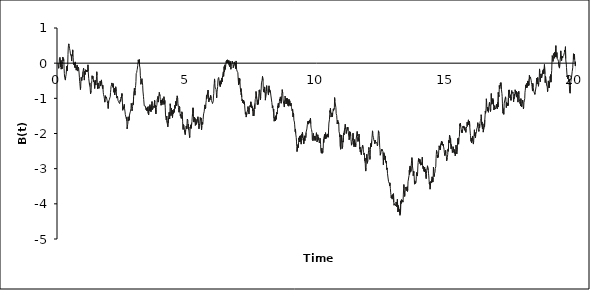
| Category | Series 0 |
|---|---|
| 0.0 | 0 |
| 0.01 | -0.082 |
| 0.02 | -0.145 |
| 0.03 | -0.094 |
| 0.04 | -0.017 |
| 0.05 | 0.13 |
| 0.06 | 0.143 |
| 0.07 | 0.163 |
| 0.08 | 0.085 |
| 0.09 | -0.014 |
| 0.1 | -0.109 |
| 0.11 | 0.081 |
| 0.12 | -0.17 |
| 0.13 | -0.177 |
| 0.14 | -0.107 |
| 0.15 | -0.161 |
| 0.16 | -0.052 |
| 0.17 | 0.055 |
| 0.18 | 0.176 |
| 0.19 | 0.122 |
| 0.2 | 0.074 |
| 0.21 | 0.126 |
| 0.22 | 0.069 |
| 0.23 | -0.16 |
| 0.24 | -0.299 |
| 0.25 | -0.403 |
| 0.26 | -0.421 |
| 0.27 | -0.393 |
| 0.28 | -0.481 |
| 0.29 | -0.394 |
| 0.3 | -0.422 |
| 0.31 | -0.324 |
| 0.32 | -0.346 |
| 0.33 | -0.086 |
| 0.34 | -0.19 |
| 0.35 | -0.224 |
| 0.36 | -0.081 |
| 0.37 | -0.04 |
| 0.38 | 0.252 |
| 0.39 | 0.431 |
| 0.4 | 0.512 |
| 0.41 | 0.549 |
| 0.42 | 0.518 |
| 0.43 | 0.499 |
| 0.44 | 0.422 |
| 0.45 | 0.434 |
| 0.46 | 0.35 |
| 0.47 | 0.286 |
| 0.48 | 0.305 |
| 0.49 | 0.214 |
| 0.5 | 0.199 |
| 0.51 | 0.183 |
| 0.52 | 0.061 |
| 0.53 | 0.24 |
| 0.54 | 0.218 |
| 0.55 | 0.21 |
| 0.56 | 0.378 |
| 0.57 | 0.309 |
| 0.58 | 0.155 |
| 0.59 | -0.017 |
| 0.6 | -0.046 |
| 0.61 | -0.032 |
| 0.62 | -0.006 |
| 0.63 | -0.026 |
| 0.64 | -0.121 |
| 0.65 | 0.006 |
| 0.66 | 0.036 |
| 0.67 | -0.06 |
| 0.68 | -0.133 |
| 0.69 | -0.102 |
| 0.7 | -0.198 |
| 0.71 | -0.143 |
| 0.72 | -0.109 |
| 0.73 | -0.051 |
| 0.74 | -0.057 |
| 0.75 | -0.118 |
| 0.76 | -0.225 |
| 0.77 | -0.112 |
| 0.78 | -0.116 |
| 0.79 | -0.144 |
| 0.8 | -0.207 |
| 0.81 | -0.228 |
| 0.82 | -0.4 |
| 0.83 | -0.525 |
| 0.84 | -0.586 |
| 0.85 | -0.582 |
| 0.86 | -0.751 |
| 0.87 | -0.669 |
| 0.88 | -0.486 |
| 0.89 | -0.403 |
| 0.9 | -0.422 |
| 0.91 | -0.493 |
| 0.92 | -0.459 |
| 0.93 | -0.428 |
| 0.94 | -0.35 |
| 0.95 | -0.387 |
| 0.96 | -0.241 |
| 0.97 | -0.231 |
| 0.98 | -0.143 |
| 0.99 | -0.192 |
| 1.0 | -0.271 |
| 1.01 | -0.482 |
| 1.02 | -0.236 |
| 1.03 | -0.237 |
| 1.04 | -0.324 |
| 1.05 | -0.268 |
| 1.06 | -0.186 |
| 1.07 | -0.18 |
| 1.08 | -0.23 |
| 1.09 | -0.201 |
| 1.1 | -0.245 |
| 1.11 | -0.195 |
| 1.12 | -0.244 |
| 1.13 | -0.268 |
| 1.14 | -0.19 |
| 1.15 | -0.047 |
| 1.16 | -0.231 |
| 1.17 | -0.236 |
| 1.18 | -0.438 |
| 1.19 | -0.446 |
| 1.2 | -0.428 |
| 1.21 | -0.619 |
| 1.22 | -0.562 |
| 1.23 | -0.669 |
| 1.24 | -0.68 |
| 1.25 | -0.872 |
| 1.26 | -0.9 |
| 1.27 | -0.792 |
| 1.28 | -0.617 |
| 1.29 | -0.574 |
| 1.3 | -0.496 |
| 1.31 | -0.357 |
| 1.32 | -0.436 |
| 1.33 | -0.405 |
| 1.34 | -0.37 |
| 1.35 | -0.414 |
| 1.36 | -0.416 |
| 1.37 | -0.531 |
| 1.38 | -0.492 |
| 1.39 | -0.53 |
| 1.4 | -0.649 |
| 1.41 | -0.72 |
| 1.42 | -0.538 |
| 1.43 | -0.58 |
| 1.44 | -0.494 |
| 1.45 | -0.622 |
| 1.46 | -0.583 |
| 1.47 | -0.542 |
| 1.48 | -0.387 |
| 1.49 | -0.244 |
| 1.5 | -0.342 |
| 1.51 | -0.543 |
| 1.52 | -0.726 |
| 1.53 | -0.67 |
| 1.54 | -0.56 |
| 1.55 | -0.668 |
| 1.56 | -0.644 |
| 1.57 | -0.723 |
| 1.58 | -0.701 |
| 1.59 | -0.726 |
| 1.6 | -0.675 |
| 1.61 | -0.677 |
| 1.62 | -0.507 |
| 1.63 | -0.613 |
| 1.64 | -0.649 |
| 1.65 | -0.582 |
| 1.66 | -0.573 |
| 1.67 | -0.476 |
| 1.68 | -0.584 |
| 1.69 | -0.558 |
| 1.7 | -0.649 |
| 1.71 | -0.717 |
| 1.72 | -0.627 |
| 1.73 | -0.731 |
| 1.74 | -0.828 |
| 1.75 | -0.892 |
| 1.76 | -0.909 |
| 1.77 | -0.948 |
| 1.78 | -0.995 |
| 1.79 | -0.972 |
| 1.8 | -1.108 |
| 1.81 | -1.03 |
| 1.82 | -0.924 |
| 1.83 | -0.997 |
| 1.84 | -1.01 |
| 1.85 | -1.004 |
| 1.86 | -0.958 |
| 1.87 | -0.968 |
| 1.88 | -0.938 |
| 1.89 | -1.068 |
| 1.9 | -1.071 |
| 1.91 | -1.143 |
| 1.92 | -1.144 |
| 1.93 | -1.29 |
| 1.94 | -1.28 |
| 1.95 | -1.078 |
| 1.96 | -1.062 |
| 1.97 | -1.098 |
| 1.98 | -1.027 |
| 1.99 | -0.989 |
| 2.0 | -0.98 |
| 2.01 | -0.956 |
| 2.02 | -0.834 |
| 2.03 | -0.755 |
| 2.04 | -0.663 |
| 2.05 | -0.665 |
| 2.06 | -0.616 |
| 2.07 | -0.562 |
| 2.08 | -0.607 |
| 2.09 | -0.583 |
| 2.1 | -0.656 |
| 2.11 | -0.686 |
| 2.12 | -0.581 |
| 2.13 | -0.621 |
| 2.14 | -0.729 |
| 2.15 | -0.829 |
| 2.16 | -0.744 |
| 2.17 | -0.706 |
| 2.18 | -0.904 |
| 2.19 | -0.862 |
| 2.2 | -0.847 |
| 2.21 | -0.827 |
| 2.22 | -0.67 |
| 2.23 | -0.677 |
| 2.24 | -0.791 |
| 2.25 | -0.905 |
| 2.26 | -0.993 |
| 2.27 | -0.988 |
| 2.28 | -0.981 |
| 2.29 | -0.942 |
| 2.3 | -0.955 |
| 2.31 | -1.064 |
| 2.32 | -1.045 |
| 2.33 | -1.096 |
| 2.34 | -1.124 |
| 2.35 | -1.096 |
| 2.36 | -1.068 |
| 2.37 | -1.149 |
| 2.38 | -1.145 |
| 2.39 | -1.052 |
| 2.4 | -1.053 |
| 2.41 | -1.087 |
| 2.42 | -1.005 |
| 2.43 | -0.964 |
| 2.44 | -0.994 |
| 2.45 | -0.972 |
| 2.46 | -0.864 |
| 2.47 | -0.939 |
| 2.48 | -1.132 |
| 2.49 | -1.339 |
| 2.5 | -1.313 |
| 2.51 | -1.241 |
| 2.52 | -1.294 |
| 2.53 | -1.255 |
| 2.54 | -1.241 |
| 2.55 | -1.172 |
| 2.56 | -1.285 |
| 2.57 | -1.287 |
| 2.58 | -1.386 |
| 2.59 | -1.458 |
| 2.6 | -1.484 |
| 2.61 | -1.467 |
| 2.62 | -1.439 |
| 2.63 | -1.581 |
| 2.64 | -1.546 |
| 2.65 | -1.643 |
| 2.66 | -1.868 |
| 2.67 | -1.811 |
| 2.68 | -1.747 |
| 2.69 | -1.707 |
| 2.7 | -1.525 |
| 2.71 | -1.645 |
| 2.72 | -1.586 |
| 2.73 | -1.606 |
| 2.74 | -1.623 |
| 2.75 | -1.481 |
| 2.76 | -1.458 |
| 2.77 | -1.415 |
| 2.78 | -1.423 |
| 2.79 | -1.366 |
| 2.8 | -1.358 |
| 2.81 | -1.286 |
| 2.82 | -1.144 |
| 2.83 | -1.201 |
| 2.84 | -1.274 |
| 2.85 | -1.356 |
| 2.86 | -1.3 |
| 2.87 | -1.23 |
| 2.88 | -1.159 |
| 2.89 | -1.129 |
| 2.9 | -1.178 |
| 2.91 | -0.948 |
| 2.92 | -0.818 |
| 2.93 | -0.779 |
| 2.94 | -0.713 |
| 2.95 | -0.827 |
| 2.96 | -0.911 |
| 2.97 | -0.786 |
| 2.98 | -0.696 |
| 2.99 | -0.628 |
| 3.0 | -0.522 |
| 3.01 | -0.299 |
| 3.02 | -0.312 |
| 3.03 | -0.261 |
| 3.04 | -0.209 |
| 3.05 | -0.178 |
| 3.06 | -0.15 |
| 3.07 | -0.066 |
| 3.08 | 0.01 |
| 3.09 | 0.093 |
| 3.1 | 0.045 |
| 3.11 | 0.007 |
| 3.12 | 0.032 |
| 3.13 | 0.102 |
| 3.14 | -0.078 |
| 3.15 | -0.112 |
| 3.16 | -0.164 |
| 3.17 | -0.36 |
| 3.18 | -0.441 |
| 3.19 | -0.601 |
| 3.2 | -0.608 |
| 3.21 | -0.59 |
| 3.22 | -0.477 |
| 3.23 | -0.441 |
| 3.24 | -0.47 |
| 3.25 | -0.563 |
| 3.26 | -0.633 |
| 3.27 | -0.792 |
| 3.28 | -0.796 |
| 3.29 | -0.942 |
| 3.3 | -1.034 |
| 3.31 | -1.062 |
| 3.32 | -1.213 |
| 3.33 | -1.227 |
| 3.34 | -1.198 |
| 3.35 | -1.236 |
| 3.36 | -1.219 |
| 3.37 | -1.22 |
| 3.38 | -1.204 |
| 3.39 | -1.325 |
| 3.4 | -1.313 |
| 3.41 | -1.272 |
| 3.42 | -1.251 |
| 3.43 | -1.359 |
| 3.44 | -1.277 |
| 3.45 | -1.281 |
| 3.46 | -1.241 |
| 3.47 | -1.424 |
| 3.48 | -1.449 |
| 3.49 | -1.474 |
| 3.5 | -1.316 |
| 3.51 | -1.227 |
| 3.52 | -1.348 |
| 3.53 | -1.253 |
| 3.54 | -1.18 |
| 3.55 | -1.257 |
| 3.56 | -1.357 |
| 3.57 | -1.248 |
| 3.58 | -1.38 |
| 3.59 | -1.368 |
| 3.6 | -1.2 |
| 3.61 | -1.149 |
| 3.62 | -1.091 |
| 3.63 | -1.268 |
| 3.64 | -1.321 |
| 3.65 | -1.347 |
| 3.66 | -1.262 |
| 3.67 | -1.291 |
| 3.68 | -1.226 |
| 3.69 | -1.218 |
| 3.7 | -1.265 |
| 3.71 | -1.25 |
| 3.72 | -1.06 |
| 3.73 | -1.096 |
| 3.74 | -1.254 |
| 3.75 | -1.203 |
| 3.76 | -1.383 |
| 3.77 | -1.445 |
| 3.78 | -1.335 |
| 3.79 | -1.257 |
| 3.8 | -1.213 |
| 3.81 | -1.177 |
| 3.82 | -1.024 |
| 3.83 | -1.039 |
| 3.84 | -0.989 |
| 3.85 | -0.944 |
| 3.86 | -1.107 |
| 3.87 | -1.043 |
| 3.88 | -0.952 |
| 3.89 | -0.952 |
| 3.9 | -0.83 |
| 3.91 | -0.857 |
| 3.92 | -0.847 |
| 3.93 | -0.94 |
| 3.94 | -1.038 |
| 3.95 | -1.128 |
| 3.96 | -1.062 |
| 3.97 | -1.195 |
| 3.98 | -1.165 |
| 3.99 | -1.05 |
| 4.0 | -1.137 |
| 4.01 | -1.105 |
| 4.02 | -1.011 |
| 4.03 | -1.105 |
| 4.04 | -1.18 |
| 4.05 | -1.18 |
| 4.06 | -1.169 |
| 4.07 | -1.071 |
| 4.08 | -0.953 |
| 4.09 | -1.049 |
| 4.1 | -1.168 |
| 4.11 | -1.058 |
| 4.12 | -1.153 |
| 4.13 | -1.252 |
| 4.14 | -1.473 |
| 4.15 | -1.487 |
| 4.16 | -1.575 |
| 4.17 | -1.615 |
| 4.18 | -1.539 |
| 4.19 | -1.505 |
| 4.2 | -1.686 |
| 4.21 | -1.693 |
| 4.22 | -1.764 |
| 4.23 | -1.81 |
| 4.24 | -1.66 |
| 4.25 | -1.69 |
| 4.26 | -1.556 |
| 4.27 | -1.461 |
| 4.28 | -1.397 |
| 4.29 | -1.52 |
| 4.3 | -1.584 |
| 4.31 | -1.381 |
| 4.32 | -1.154 |
| 4.33 | -1.221 |
| 4.34 | -1.299 |
| 4.35 | -1.495 |
| 4.36 | -1.382 |
| 4.37 | -1.281 |
| 4.38 | -1.45 |
| 4.39 | -1.414 |
| 4.4 | -1.333 |
| 4.41 | -1.545 |
| 4.42 | -1.409 |
| 4.43 | -1.44 |
| 4.44 | -1.447 |
| 4.45 | -1.366 |
| 4.46 | -1.412 |
| 4.47 | -1.311 |
| 4.48 | -1.381 |
| 4.49 | -1.29 |
| 4.5 | -1.197 |
| 4.51 | -1.285 |
| 4.52 | -1.239 |
| 4.53 | -1.088 |
| 4.54 | -1.147 |
| 4.55 | -1.143 |
| 4.56 | -1.171 |
| 4.57 | -1.208 |
| 4.58 | -0.987 |
| 4.59 | -0.929 |
| 4.6 | -0.945 |
| 4.61 | -1.001 |
| 4.62 | -1.14 |
| 4.63 | -1.123 |
| 4.64 | -1.263 |
| 4.65 | -1.33 |
| 4.66 | -1.395 |
| 4.67 | -1.31 |
| 4.68 | -1.23 |
| 4.69 | -1.264 |
| 4.7 | -1.424 |
| 4.71 | -1.493 |
| 4.72 | -1.456 |
| 4.73 | -1.471 |
| 4.74 | -1.458 |
| 4.75 | -1.569 |
| 4.76 | -1.515 |
| 4.769999999999999 | -1.382 |
| 4.78 | -1.409 |
| 4.79 | -1.45 |
| 4.8 | -1.649 |
| 4.81 | -1.843 |
| 4.82 | -1.887 |
| 4.83 | -1.746 |
| 4.84 | -1.719 |
| 4.85 | -1.782 |
| 4.86 | -1.778 |
| 4.87 | -1.877 |
| 4.88 | -1.966 |
| 4.89 | -1.906 |
| 4.9 | -2.028 |
| 4.91 | -1.964 |
| 4.92 | -1.949 |
| 4.93 | -1.941 |
| 4.94 | -1.789 |
| 4.95 | -1.868 |
| 4.96 | -1.783 |
| 4.97 | -1.712 |
| 4.98 | -1.588 |
| 4.99 | -1.584 |
| 5.0 | -1.617 |
| 5.01 | -1.865 |
| 5.02 | -1.732 |
| 5.03 | -1.74 |
| 5.04 | -1.911 |
| 5.05 | -1.9 |
| 5.06 | -1.918 |
| 5.07 | -2.117 |
| 5.08 | -2.081 |
| 5.09 | -1.816 |
| 5.1 | -1.847 |
| 5.11 | -1.755 |
| 5.12 | -1.794 |
| 5.13 | -1.857 |
| 5.14 | -1.851 |
| 5.15 | -1.708 |
| 5.16 | -1.655 |
| 5.17 | -1.535 |
| 5.18 | -1.446 |
| 5.19 | -1.5 |
| 5.2 | -1.27 |
| 5.21 | -1.416 |
| 5.22 | -1.566 |
| 5.23 | -1.676 |
| 5.24 | -1.614 |
| 5.25 | -1.533 |
| 5.26 | -1.613 |
| 5.27 | -1.558 |
| 5.28 | -1.683 |
| 5.29 | -1.771 |
| 5.3 | -1.733 |
| 5.31 | -1.596 |
| 5.32 | -1.634 |
| 5.33 | -1.742 |
| 5.34 | -1.768 |
| 5.35 | -1.74 |
| 5.36 | -1.734 |
| 5.37 | -1.586 |
| 5.38 | -1.57 |
| 5.39 | -1.524 |
| 5.4 | -1.508 |
| 5.41 | -1.719 |
| 5.42 | -1.777 |
| 5.43 | -1.868 |
| 5.44 | -1.761 |
| 5.45 | -1.761 |
| 5.46 | -1.73 |
| 5.47 | -1.611 |
| 5.48 | -1.546 |
| 5.49 | -1.547 |
| 5.5 | -1.62 |
| 5.51 | -1.558 |
| 5.52 | -1.773 |
| 5.53 | -1.896 |
| 5.54 | -1.78 |
| 5.55 | -1.675 |
| 5.56 | -1.683 |
| 5.57 | -1.739 |
| 5.58 | -1.69 |
| 5.59 | -1.606 |
| 5.6 | -1.502 |
| 5.61 | -1.441 |
| 5.62 | -1.447 |
| 5.63 | -1.382 |
| 5.64 | -1.368 |
| 5.65 | -1.226 |
| 5.66 | -1.187 |
| 5.67 | -1.194 |
| 5.68 | -1.292 |
| 5.69 | -1.259 |
| 5.7 | -1.113 |
| 5.71 | -1.07 |
| 5.72 | -0.917 |
| 5.73 | -1.01 |
| 5.74 | -1.025 |
| 5.75 | -1.028 |
| 5.76 | -0.85 |
| 5.769999999999999 | -0.845 |
| 5.78 | -0.763 |
| 5.79 | -0.869 |
| 5.8 | -0.963 |
| 5.81 | -1.103 |
| 5.82 | -1.111 |
| 5.83 | -0.999 |
| 5.84 | -1.004 |
| 5.85 | -1.045 |
| 5.86 | -1.07 |
| 5.87 | -1.061 |
| 5.88 | -0.915 |
| 5.89 | -0.912 |
| 5.9 | -0.99 |
| 5.91 | -1.06 |
| 5.92 | -1.037 |
| 5.93 | -1.087 |
| 5.94 | -1.115 |
| 5.95 | -1.149 |
| 5.96 | -1.158 |
| 5.97 | -1.122 |
| 5.98 | -1.088 |
| 5.99 | -0.931 |
| 6.0 | -0.867 |
| 6.01 | -0.652 |
| 6.02 | -0.575 |
| 6.03 | -0.448 |
| 6.04 | -0.541 |
| 6.05 | -0.679 |
| 6.06 | -0.696 |
| 6.07 | -0.651 |
| 6.08 | -0.68 |
| 6.09 | -0.749 |
| 6.1 | -0.838 |
| 6.11 | -0.991 |
| 6.12 | -0.916 |
| 6.13 | -0.793 |
| 6.14 | -0.753 |
| 6.15 | -0.665 |
| 6.16 | -0.508 |
| 6.17 | -0.441 |
| 6.18 | -0.431 |
| 6.19 | -0.407 |
| 6.2 | -0.406 |
| 6.21 | -0.504 |
| 6.22 | -0.626 |
| 6.23 | -0.555 |
| 6.24 | -0.523 |
| 6.25 | -0.665 |
| 6.26 | -0.61 |
| 6.27 | -0.499 |
| 6.28 | -0.598 |
| 6.29 | -0.618 |
| 6.3 | -0.521 |
| 6.31 | -0.42 |
| 6.32 | -0.532 |
| 6.33 | -0.457 |
| 6.34 | -0.358 |
| 6.35 | -0.38 |
| 6.36 | -0.358 |
| 6.37 | -0.246 |
| 6.38 | -0.375 |
| 6.39 | -0.253 |
| 6.4 | -0.098 |
| 6.41 | -0.244 |
| 6.42 | -0.193 |
| 6.43 | -0.046 |
| 6.44 | -0.177 |
| 6.45 | -0.186 |
| 6.46 | -0.078 |
| 6.47 | -0.092 |
| 6.48 | 0.051 |
| 6.49 | 0.016 |
| 6.5 | -0.008 |
| 6.51 | 0.089 |
| 6.52 | 0.006 |
| 6.53 | 0.095 |
| 6.54 | 0.052 |
| 6.55 | 0.01 |
| 6.56 | 0.012 |
| 6.57 | 0.033 |
| 6.58 | 0.075 |
| 6.59 | -0.053 |
| 6.6 | -0.026 |
| 6.61 | -0.036 |
| 6.62 | -0.102 |
| 6.63 | 0.052 |
| 6.64 | 0.054 |
| 6.65 | -0.05 |
| 6.66 | -0.173 |
| 6.67 | -0.104 |
| 6.68 | -0.047 |
| 6.69 | -0.063 |
| 6.7 | -0.002 |
| 6.71 | 0.06 |
| 6.72 | 0.062 |
| 6.73 | 0.036 |
| 6.74 | 0.007 |
| 6.75 | -0.13 |
| 6.76 | -0.104 |
| 6.769999999999999 | -0.122 |
| 6.78 | -0.052 |
| 6.79 | -0.042 |
| 6.8 | 0.036 |
| 6.81 | 0.004 |
| 6.82 | -0.041 |
| 6.83 | -0.01 |
| 6.84 | -0.152 |
| 6.85 | -0.118 |
| 6.86 | 0.063 |
| 6.87 | 0.027 |
| 6.88 | -0.172 |
| 6.89 | -0.2 |
| 6.9 | -0.228 |
| 6.91 | -0.233 |
| 6.92 | -0.236 |
| 6.93 | -0.272 |
| 6.94 | -0.422 |
| 6.95 | -0.404 |
| 6.96 | -0.622 |
| 6.97 | -0.421 |
| 6.98 | -0.456 |
| 6.99 | -0.577 |
| 7.0 | -0.44 |
| 7.01 | -0.497 |
| 7.02 | -0.678 |
| 7.03 | -0.687 |
| 7.04 | -0.806 |
| 7.05 | -0.723 |
| 7.06 | -0.898 |
| 7.07 | -0.844 |
| 7.08 | -0.967 |
| 7.09 | -1.071 |
| 7.1 | -1.035 |
| 7.11 | -1.036 |
| 7.12 | -1.043 |
| 7.13 | -1.133 |
| 7.14 | -1.113 |
| 7.15 | -1.049 |
| 7.16 | -1.042 |
| 7.17 | -1.155 |
| 7.18 | -1.1 |
| 7.19 | -1.197 |
| 7.2 | -1.192 |
| 7.21 | -1.374 |
| 7.22 | -1.45 |
| 7.23 | -1.386 |
| 7.24 | -1.463 |
| 7.25 | -1.533 |
| 7.26 | -1.56 |
| 7.27 | -1.511 |
| 7.28 | -1.414 |
| 7.29 | -1.406 |
| 7.3 | -1.42 |
| 7.31 | -1.314 |
| 7.32 | -1.233 |
| 7.33 | -1.327 |
| 7.34 | -1.394 |
| 7.35 | -1.412 |
| 7.36 | -1.446 |
| 7.37 | -1.261 |
| 7.38 | -1.222 |
| 7.39 | -1.2 |
| 7.4 | -1.24 |
| 7.41 | -1.191 |
| 7.42 | -1.249 |
| 7.43 | -1.099 |
| 7.44 | -1.184 |
| 7.45 | -1.213 |
| 7.46 | -1.184 |
| 7.47 | -1.271 |
| 7.48 | -1.235 |
| 7.49 | -1.275 |
| 7.5 | -1.36 |
| 7.51 | -1.291 |
| 7.52 | -1.495 |
| 7.53 | -1.458 |
| 7.54 | -1.455 |
| 7.55 | -1.496 |
| 7.56 | -1.319 |
| 7.57 | -1.205 |
| 7.58 | -1.299 |
| 7.59 | -1.141 |
| 7.6 | -1.029 |
| 7.61 | -0.998 |
| 7.62 | -0.933 |
| 7.63 | -0.805 |
| 7.64 | -0.827 |
| 7.65 | -0.823 |
| 7.66 | -1.012 |
| 7.67 | -1.125 |
| 7.68 | -1.173 |
| 7.69 | -1.094 |
| 7.7 | -1.178 |
| 7.71 | -1.039 |
| 7.72 | -1.148 |
| 7.73 | -1.047 |
| 7.74 | -0.868 |
| 7.75 | -0.77 |
| 7.76 | -0.806 |
| 7.769999999999999 | -0.759 |
| 7.78 | -0.768 |
| 7.79 | -0.786 |
| 7.8 | -1.041 |
| 7.81 | -0.962 |
| 7.82 | -0.832 |
| 7.83 | -0.707 |
| 7.84 | -0.56 |
| 7.85 | -0.563 |
| 7.86 | -0.501 |
| 7.87 | -0.442 |
| 7.88 | -0.376 |
| 7.89 | -0.375 |
| 7.9 | -0.494 |
| 7.91 | -0.716 |
| 7.92 | -0.816 |
| 7.93 | -0.782 |
| 7.94 | -0.729 |
| 7.95 | -0.828 |
| 7.96 | -0.676 |
| 7.97 | -0.73 |
| 7.98 | -0.797 |
| 7.99 | -1.052 |
| 8.0 | -1.038 |
| 8.01 | -1.029 |
| 8.02 | -0.814 |
| 8.03 | -0.733 |
| 8.04 | -0.639 |
| 8.05 | -0.795 |
| 8.06 | -0.792 |
| 8.07 | -0.78 |
| 8.08 | -0.784 |
| 8.09 | -0.838 |
| 8.1 | -0.834 |
| 8.11 | -0.906 |
| 8.12 | -0.734 |
| 8.13 | -0.644 |
| 8.14 | -0.825 |
| 8.15 | -0.736 |
| 8.16 | -0.809 |
| 8.17 | -0.788 |
| 8.18 | -0.778 |
| 8.19 | -0.759 |
| 8.2 | -0.906 |
| 8.21 | -0.882 |
| 8.22 | -0.926 |
| 8.23 | -0.891 |
| 8.24 | -1.12 |
| 8.25 | -1.194 |
| 8.26 | -1.273 |
| 8.27 | -1.209 |
| 8.28 | -1.242 |
| 8.29 | -1.259 |
| 8.3 | -1.371 |
| 8.31 | -1.308 |
| 8.32 | -1.569 |
| 8.33 | -1.651 |
| 8.34 | -1.637 |
| 8.35 | -1.547 |
| 8.36 | -1.562 |
| 8.37 | -1.575 |
| 8.38 | -1.643 |
| 8.39 | -1.496 |
| 8.4 | -1.543 |
| 8.41 | -1.598 |
| 8.42 | -1.572 |
| 8.43 | -1.401 |
| 8.44 | -1.443 |
| 8.45 | -1.41 |
| 8.46 | -1.312 |
| 8.47 | -1.214 |
| 8.48 | -1.26 |
| 8.49 | -1.143 |
| 8.5 | -1.263 |
| 8.51 | -1.241 |
| 8.52 | -1.209 |
| 8.53 | -1.096 |
| 8.54 | -1.027 |
| 8.55 | -1.067 |
| 8.56 | -1.091 |
| 8.57 | -0.959 |
| 8.58 | -1.067 |
| 8.59 | -0.998 |
| 8.6 | -1.139 |
| 8.61 | -1.027 |
| 8.62 | -0.926 |
| 8.63 | -0.835 |
| 8.64 | -0.753 |
| 8.65 | -0.729 |
| 8.66 | -0.857 |
| 8.67 | -1.017 |
| 8.68 | -1.076 |
| 8.69 | -1.07 |
| 8.7 | -1.072 |
| 8.71 | -1.072 |
| 8.72 | -1.248 |
| 8.73 | -1.243 |
| 8.74 | -1.053 |
| 8.75 | -0.939 |
| 8.76 | -0.981 |
| 8.77 | -0.977 |
| 8.78 | -1.156 |
| 8.79 | -1.165 |
| 8.8 | -1.121 |
| 8.81 | -0.997 |
| 8.82 | -1.15 |
| 8.83 | -1.155 |
| 8.84 | -1.005 |
| 8.85 | -1.098 |
| 8.86 | -1.206 |
| 8.87 | -1.074 |
| 8.88 | -1.143 |
| 8.89 | -1.224 |
| 8.9 | -1.029 |
| 8.91 | -1.185 |
| 8.92 | -1.212 |
| 8.93 | -1.07 |
| 8.94 | -1.075 |
| 8.95 | -1.209 |
| 8.96 | -1.196 |
| 8.97 | -1.208 |
| 8.98 | -1.14 |
| 8.99 | -1.223 |
| 9.0 | -1.268 |
| 9.01 | -1.256 |
| 9.02 | -1.349 |
| 9.03 | -1.367 |
| 9.04 | -1.305 |
| 9.05 | -1.31 |
| 9.06 | -1.53 |
| 9.07 | -1.421 |
| 9.08 | -1.452 |
| 9.09 | -1.622 |
| 9.1 | -1.623 |
| 9.11 | -1.674 |
| 9.12 | -1.755 |
| 9.13 | -1.737 |
| 9.14 | -1.949 |
| 9.15 | -1.871 |
| 9.16 | -2.003 |
| 9.17 | -2.011 |
| 9.18 | -2.114 |
| 9.19 | -2.217 |
| 9.2 | -2.372 |
| 9.21 | -2.514 |
| 9.22 | -2.512 |
| 9.23 | -2.492 |
| 9.24 | -2.346 |
| 9.25 | -2.311 |
| 9.26 | -2.401 |
| 9.27 | -2.26 |
| 9.28 | -2.126 |
| 9.29 | -2.18 |
| 9.3 | -2.158 |
| 9.31 | -2.073 |
| 9.32 | -2.238 |
| 9.33 | -2.238 |
| 9.34 | -2.062 |
| 9.35 | -2.206 |
| 9.36 | -2.221 |
| 9.37 | -2.303 |
| 9.38 | -2.243 |
| 9.39 | -2.057 |
| 9.4 | -2.012 |
| 9.41 | -2.107 |
| 9.42 | -1.967 |
| 9.43 | -1.982 |
| 9.44 | -2.132 |
| 9.45 | -2.19 |
| 9.46 | -2.141 |
| 9.47 | -2.291 |
| 9.48 | -2.219 |
| 9.49 | -2.118 |
| 9.5 | -2.066 |
| 9.51 | -2.206 |
| 9.52 | -2.135 |
| 9.53 | -2.075 |
| 9.54 | -2.1 |
| 9.55 | -2.111 |
| 9.56 | -1.972 |
| 9.57 | -1.93 |
| 9.58 | -1.904 |
| 9.59 | -1.87 |
| 9.6 | -1.854 |
| 9.61 | -1.741 |
| 9.62 | -1.749 |
| 9.63 | -1.653 |
| 9.64 | -1.735 |
| 9.65 | -1.65 |
| 9.66 | -1.622 |
| 9.67 | -1.707 |
| 9.68 | -1.696 |
| 9.69 | -1.63 |
| 9.7 | -1.603 |
| 9.71 | -1.681 |
| 9.72 | -1.671 |
| 9.73 | -1.561 |
| 9.74 | -1.723 |
| 9.75 | -1.823 |
| 9.76 | -1.861 |
| 9.77 | -1.889 |
| 9.78 | -1.882 |
| 9.79 | -1.976 |
| 9.8 | -2.175 |
| 9.81 | -2.197 |
| 9.82 | -2.204 |
| 9.83 | -2.05 |
| 9.84 | -1.996 |
| 9.85 | -2.054 |
| 9.86 | -2.062 |
| 9.87 | -2.198 |
| 9.88 | -2.071 |
| 9.89 | -2.111 |
| 9.9 | -2.073 |
| 9.91 | -2.053 |
| 9.92 | -2.054 |
| 9.93 | -2.195 |
| 9.94 | -2.128 |
| 9.95 | -2.02 |
| 9.96 | -1.978 |
| 9.97 | -2.08 |
| 9.98 | -2.239 |
| 9.99 | -2.243 |
| 10.0 | -2.191 |
| 10.01 | -2.035 |
| 10.02 | -2.088 |
| 10.03 | -2.141 |
| 10.04 | -2.101 |
| 10.05 | -2.186 |
| 10.06 | -2.215 |
| 10.07 | -2.264 |
| 10.08 | -2.231 |
| 10.09 | -2.169 |
| 10.1 | -2.136 |
| 10.11 | -2.178 |
| 10.12 | -2.306 |
| 10.13 | -2.504 |
| 10.14 | -2.489 |
| 10.15 | -2.557 |
| 10.16 | -2.475 |
| 10.17 | -2.415 |
| 10.18 | -2.563 |
| 10.19 | -2.505 |
| 10.2 | -2.545 |
| 10.21 | -2.506 |
| 10.22 | -2.418 |
| 10.23 | -2.172 |
| 10.24 | -2.257 |
| 10.25 | -2.238 |
| 10.26 | -2.085 |
| 10.27 | -2.025 |
| 10.28 | -2.146 |
| 10.29 | -2.11 |
| 10.3 | -2.152 |
| 10.31 | -1.978 |
| 10.32 | -2.08 |
| 10.33 | -2.144 |
| 10.34 | -2.091 |
| 10.35 | -2.037 |
| 10.36 | -2.094 |
| 10.37 | -2.08 |
| 10.38 | -2.11 |
| 10.39 | -2.072 |
| 10.4 | -2.012 |
| 10.41 | -2.106 |
| 10.42 | -2.05 |
| 10.43 | -1.843 |
| 10.44 | -1.703 |
| 10.45 | -1.687 |
| 10.46 | -1.611 |
| 10.47 | -1.471 |
| 10.48 | -1.349 |
| 10.49 | -1.401 |
| 10.5 | -1.277 |
| 10.51 | -1.432 |
| 10.52 | -1.532 |
| 10.53 | -1.503 |
| 10.54 | -1.462 |
| 10.55 | -1.457 |
| 10.56 | -1.412 |
| 10.57 | -1.522 |
| 10.58 | -1.49 |
| 10.59 | -1.402 |
| 10.6 | -1.363 |
| 10.61 | -1.302 |
| 10.62 | -1.344 |
| 10.63 | -1.351 |
| 10.64 | -1.32 |
| 10.65 | -1.269 |
| 10.66 | -0.979 |
| 10.67 | -1.075 |
| 10.68 | -1.06 |
| 10.69 | -1.083 |
| 10.7 | -1.103 |
| 10.71 | -1.268 |
| 10.72 | -1.432 |
| 10.73 | -1.459 |
| 10.74 | -1.488 |
| 10.75 | -1.596 |
| 10.76 | -1.726 |
| 10.77 | -1.721 |
| 10.78 | -1.625 |
| 10.79 | -1.632 |
| 10.8 | -1.727 |
| 10.81 | -1.682 |
| 10.82 | -1.712 |
| 10.83 | -1.94 |
| 10.84 | -1.934 |
| 10.85 | -2.011 |
| 10.86 | -2.095 |
| 10.87 | -2.037 |
| 10.88 | -2.369 |
| 10.89 | -2.449 |
| 10.9 | -2.336 |
| 10.91 | -2.276 |
| 10.92 | -2.183 |
| 10.93 | -2.045 |
| 10.94 | -2.234 |
| 10.95 | -2.43 |
| 10.96 | -2.401 |
| 10.97 | -2.365 |
| 10.98 | -2.216 |
| 10.99 | -2.245 |
| 11.0 | -2.108 |
| 11.01 | -1.994 |
| 11.02 | -2.039 |
| 11.03 | -2.039 |
| 11.04 | -1.904 |
| 11.05 | -1.825 |
| 11.06 | -1.835 |
| 11.07 | -1.736 |
| 11.08 | -1.738 |
| 11.09 | -1.884 |
| 11.1 | -1.961 |
| 11.11 | -2 |
| 11.12 | -1.929 |
| 11.13 | -1.88 |
| 11.14 | -1.867 |
| 11.15 | -1.818 |
| 11.16 | -1.878 |
| 11.17 | -1.824 |
| 11.18 | -1.926 |
| 11.19 | -1.932 |
| 11.2 | -2.043 |
| 11.21 | -2.102 |
| 11.22 | -2.179 |
| 11.23 | -2.13 |
| 11.24 | -1.943 |
| 11.25 | -2.007 |
| 11.26 | -1.981 |
| 11.27 | -1.969 |
| 11.28 | -2.067 |
| 11.29 | -2.177 |
| 11.3 | -2.238 |
| 11.31 | -2.332 |
| 11.32 | -2.325 |
| 11.33 | -2.275 |
| 11.34 | -2.22 |
| 11.35 | -2.2 |
| 11.36 | -2.107 |
| 11.37 | -1.99 |
| 11.38 | -2.203 |
| 11.39 | -2.324 |
| 11.4 | -2.222 |
| 11.41 | -2.376 |
| 11.42 | -2.283 |
| 11.43 | -2.172 |
| 11.44 | -2.323 |
| 11.45 | -2.268 |
| 11.46 | -2.277 |
| 11.47 | -2.384 |
| 11.48 | -2.292 |
| 11.49 | -2.158 |
| 11.5 | -2.138 |
| 11.51 | -2.172 |
| 11.52 | -2.146 |
| 11.53 | -1.943 |
| 11.54 | -2.042 |
| 11.55 | -2.089 |
| 11.56 | -2.228 |
| 11.57 | -2.118 |
| 11.58 | -2.194 |
| 11.59 | -2.163 |
| 11.6 | -2.014 |
| 11.61 | -2.116 |
| 11.62 | -2.214 |
| 11.63 | -2.435 |
| 11.64 | -2.387 |
| 11.65 | -2.526 |
| 11.66 | -2.51 |
| 11.67 | -2.48 |
| 11.68 | -2.463 |
| 11.69 | -2.6 |
| 11.7 | -2.558 |
| 11.71 | -2.421 |
| 11.72 | -2.433 |
| 11.73 | -2.428 |
| 11.74 | -2.332 |
| 11.75 | -2.324 |
| 11.76 | -2.433 |
| 11.77 | -2.502 |
| 11.78 | -2.532 |
| 11.79 | -2.602 |
| 11.8 | -2.564 |
| 11.81 | -2.605 |
| 11.82 | -2.772 |
| 11.83 | -2.697 |
| 11.84 | -2.833 |
| 11.85 | -3.007 |
| 11.86 | -3.069 |
| 11.87 | -2.983 |
| 11.88 | -2.817 |
| 11.89 | -2.661 |
| 11.9 | -2.59 |
| 11.91 | -2.766 |
| 11.92 | -2.849 |
| 11.93 | -2.842 |
| 11.94 | -2.766 |
| 11.95 | -2.646 |
| 11.96 | -2.634 |
| 11.97 | -2.477 |
| 11.98 | -2.396 |
| 11.99 | -2.435 |
| 12.0 | -2.501 |
| 12.01 | -2.54 |
| 12.02 | -2.737 |
| 12.03 | -2.644 |
| 12.04 | -2.459 |
| 12.05 | -2.283 |
| 12.06 | -2.365 |
| 12.07 | -2.327 |
| 12.08 | -2.372 |
| 12.09 | -2.22 |
| 12.1 | -2.135 |
| 12.11 | -2.042 |
| 12.12 | -1.925 |
| 12.13 | -1.976 |
| 12.14 | -2.067 |
| 12.15 | -2.057 |
| 12.16 | -2.117 |
| 12.17 | -2.181 |
| 12.18 | -2.172 |
| 12.19 | -2.195 |
| 12.2 | -2.236 |
| 12.21 | -2.293 |
| 12.22 | -2.19 |
| 12.23 | -2.234 |
| 12.24 | -2.254 |
| 12.25 | -2.263 |
| 12.26 | -2.277 |
| 12.27 | -2.262 |
| 12.28 | -2.289 |
| 12.29 | -2.258 |
| 12.3 | -2.315 |
| 12.31 | -2.349 |
| 12.32 | -2.312 |
| 12.33 | -2.191 |
| 12.34 | -2.045 |
| 12.35 | -1.923 |
| 12.36 | -1.937 |
| 12.37 | -1.991 |
| 12.38 | -2.063 |
| 12.39 | -2.084 |
| 12.4 | -2.394 |
| 12.41 | -2.454 |
| 12.42 | -2.617 |
| 12.43 | -2.628 |
| 12.44 | -2.551 |
| 12.45 | -2.545 |
| 12.46 | -2.565 |
| 12.47 | -2.452 |
| 12.48 | -2.482 |
| 12.49 | -2.453 |
| 12.5 | -2.477 |
| 12.51 | -2.443 |
| 12.52 | -2.504 |
| 12.53 | -2.725 |
| 12.54 | -2.891 |
| 12.55 | -2.69 |
| 12.56 | -2.545 |
| 12.57 | -2.643 |
| 12.58 | -2.604 |
| 12.59 | -2.634 |
| 12.6 | -2.748 |
| 12.61 | -2.641 |
| 12.62 | -2.636 |
| 12.63 | -2.817 |
| 12.64 | -2.842 |
| 12.65 | -2.783 |
| 12.66 | -2.879 |
| 12.67 | -3.026 |
| 12.68 | -2.978 |
| 12.69 | -3.022 |
| 12.7 | -3.144 |
| 12.71 | -3.149 |
| 12.72 | -3.265 |
| 12.73 | -3.267 |
| 12.74 | -3.37 |
| 12.75 | -3.356 |
| 12.76 | -3.353 |
| 12.77 | -3.42 |
| 12.78 | -3.488 |
| 12.79 | -3.404 |
| 12.8 | -3.486 |
| 12.81 | -3.562 |
| 12.82 | -3.668 |
| 12.83 | -3.734 |
| 12.84 | -3.825 |
| 12.85 | -3.826 |
| 12.86 | -3.768 |
| 12.87 | -3.837 |
| 12.88 | -3.867 |
| 12.89 | -3.741 |
| 12.9 | -3.778 |
| 12.91 | -3.8 |
| 12.92 | -3.739 |
| 12.93 | -3.71 |
| 12.94 | -3.948 |
| 12.95 | -4.039 |
| 12.96 | -4.068 |
| 12.97 | -3.997 |
| 12.98 | -4.011 |
| 12.99 | -3.993 |
| 13.0 | -4.023 |
| 13.01 | -4.058 |
| 13.02 | -4.07 |
| 13.03 | -3.947 |
| 13.04 | -3.94 |
| 13.05 | -4.007 |
| 13.06 | -4.089 |
| 13.07 | -3.966 |
| 13.08 | -3.87 |
| 13.09 | -4.066 |
| 13.1 | -4.232 |
| 13.11 | -4.093 |
| 13.12 | -4.048 |
| 13.13 | -4.043 |
| 13.14 | -4.211 |
| 13.15 | -4.159 |
| 13.16 | -4.149 |
| 13.17 | -4.271 |
| 13.18 | -4.326 |
| 13.19 | -4.209 |
| 13.2 | -4.277 |
| 13.21 | -3.916 |
| 13.22 | -3.918 |
| 13.23 | -3.987 |
| 13.24 | -3.882 |
| 13.25 | -3.92 |
| 13.26 | -3.942 |
| 13.27 | -3.918 |
| 13.28 | -3.891 |
| 13.29 | -3.953 |
| 13.3 | -3.919 |
| 13.31 | -3.723 |
| 13.32 | -3.573 |
| 13.33 | -3.452 |
| 13.34 | -3.573 |
| 13.35 | -3.627 |
| 13.36 | -3.791 |
| 13.37 | -3.702 |
| 13.38 | -3.703 |
| 13.39 | -3.556 |
| 13.4 | -3.551 |
| 13.41 | -3.521 |
| 13.42 | -3.58 |
| 13.43 | -3.601 |
| 13.44 | -3.563 |
| 13.45 | -3.632 |
| 13.46 | -3.515 |
| 13.47 | -3.645 |
| 13.48 | -3.588 |
| 13.49 | -3.372 |
| 13.5 | -3.357 |
| 13.51 | -3.352 |
| 13.52 | -3.395 |
| 13.53 | -3.191 |
| 13.54 | -3.043 |
| 13.55 | -3.161 |
| 13.56 | -2.964 |
| 13.57 | -2.923 |
| 13.58 | -3.099 |
| 13.59 | -3.009 |
| 13.6 | -3.077 |
| 13.61 | -2.956 |
| 13.62 | -2.843 |
| 13.63 | -2.774 |
| 13.64 | -2.686 |
| 13.65 | -2.684 |
| 13.66 | -2.919 |
| 13.67 | -2.894 |
| 13.68 | -3.038 |
| 13.69 | -3.201 |
| 13.7 | -3.194 |
| 13.71 | -3.073 |
| 13.72 | -3.133 |
| 13.73 | -3.265 |
| 13.74 | -3.441 |
| 13.75 | -3.346 |
| 13.76 | -3.365 |
| 13.77 | -3.354 |
| 13.78 | -3.422 |
| 13.79 | -3.442 |
| 13.8 | -3.388 |
| 13.81 | -3.228 |
| 13.82 | -3.108 |
| 13.83 | -3.108 |
| 13.84 | -3.105 |
| 13.85 | -3.21 |
| 13.86 | -3.108 |
| 13.87 | -2.922 |
| 13.88 | -2.826 |
| 13.89 | -2.753 |
| 13.9 | -2.709 |
| 13.91 | -2.794 |
| 13.92 | -2.728 |
| 13.93 | -2.771 |
| 13.94 | -2.834 |
| 13.95 | -2.74 |
| 13.96 | -2.864 |
| 13.97 | -2.809 |
| 13.98 | -2.901 |
| 13.99 | -2.917 |
| 14.0 | -2.884 |
| 14.01 | -2.857 |
| 14.02 | -2.895 |
| 14.03 | -2.802 |
| 14.04 | -2.673 |
| 14.05 | -2.893 |
| 14.06 | -2.913 |
| 14.07 | -3.001 |
| 14.08 | -2.931 |
| 14.09 | -2.943 |
| 14.1 | -2.926 |
| 14.11 | -3.076 |
| 14.12 | -3.079 |
| 14.13 | -2.957 |
| 14.14 | -3.089 |
| 14.15 | -3.013 |
| 14.16 | -3.074 |
| 14.17 | -3.172 |
| 14.18 | -3.248 |
| 14.19 | -3.283 |
| 14.2 | -3.145 |
| 14.21 | -3.044 |
| 14.22 | -3.044 |
| 14.23 | -2.977 |
| 14.24 | -2.918 |
| 14.25 | -2.917 |
| 14.26 | -2.936 |
| 14.27 | -3.043 |
| 14.28 | -3.13 |
| 14.29 | -3.206 |
| 14.3 | -3.305 |
| 14.31 | -3.424 |
| 14.32 | -3.388 |
| 14.33 | -3.478 |
| 14.34 | -3.584 |
| 14.35 | -3.56 |
| 14.36 | -3.415 |
| 14.37 | -3.364 |
| 14.38 | -3.404 |
| 14.39 | -3.363 |
| 14.4 | -3.313 |
| 14.41 | -3.385 |
| 14.42 | -3.233 |
| 14.43 | -3.244 |
| 14.44 | -3.351 |
| 14.45 | -3.38 |
| 14.46 | -3.258 |
| 14.47 | -2.957 |
| 14.48 | -3.073 |
| 14.49 | -3.134 |
| 14.5 | -3.224 |
| 14.51 | -3.145 |
| 14.52 | -3.121 |
| 14.53 | -3.099 |
| 14.54 | -2.993 |
| 14.55 | -2.991 |
| 14.56 | -2.947 |
| 14.57 | -2.715 |
| 14.58 | -2.596 |
| 14.59 | -2.481 |
| 14.6 | -2.468 |
| 14.61 | -2.561 |
| 14.62 | -2.601 |
| 14.63 | -2.698 |
| 14.64 | -2.615 |
| 14.65 | -2.676 |
| 14.66 | -2.632 |
| 14.67 | -2.553 |
| 14.68 | -2.446 |
| 14.69 | -2.35 |
| 14.7 | -2.368 |
| 14.71 | -2.42 |
| 14.72 | -2.461 |
| 14.73 | -2.431 |
| 14.74 | -2.462 |
| 14.75 | -2.306 |
| 14.76 | -2.278 |
| 14.77 | -2.256 |
| 14.78 | -2.221 |
| 14.79 | -2.326 |
| 14.8 | -2.325 |
| 14.81 | -2.236 |
| 14.82 | -2.288 |
| 14.83 | -2.335 |
| 14.84 | -2.3 |
| 14.85 | -2.307 |
| 14.86 | -2.377 |
| 14.87 | -2.41 |
| 14.88 | -2.457 |
| 14.89 | -2.541 |
| 14.9 | -2.582 |
| 14.91 | -2.629 |
| 14.92 | -2.639 |
| 14.93 | -2.509 |
| 14.94 | -2.477 |
| 14.95 | -2.567 |
| 14.96 | -2.59 |
| 14.97 | -2.66 |
| 14.98 | -2.776 |
| 14.99 | -2.762 |
| 15.0 | -2.691 |
| 15.01 | -2.717 |
| 15.02 | -2.602 |
| 15.03 | -2.451 |
| 15.04 | -2.506 |
| 15.05 | -2.413 |
| 15.06 | -2.196 |
| 15.07 | -2.271 |
| 15.08 | -2.186 |
| 15.09 | -2.044 |
| 15.1 | -2.066 |
| 15.11 | -2.122 |
| 15.12 | -2.161 |
| 15.13 | -2.131 |
| 15.14 | -2.34 |
| 15.15 | -2.436 |
| 15.16 | -2.318 |
| 15.17 | -2.321 |
| 15.18 | -2.4 |
| 15.19 | -2.387 |
| 15.2 | -2.542 |
| 15.21 | -2.553 |
| 15.22 | -2.47 |
| 15.23 | -2.376 |
| 15.24 | -2.476 |
| 15.25 | -2.535 |
| 15.26 | -2.558 |
| 15.27 | -2.537 |
| 15.28 | -2.569 |
| 15.29 | -2.453 |
| 15.3 | -2.542 |
| 15.31 | -2.635 |
| 15.32 | -2.607 |
| 15.33 | -2.521 |
| 15.34 | -2.332 |
| 15.35 | -2.443 |
| 15.36 | -2.519 |
| 15.37 | -2.582 |
| 15.38 | -2.574 |
| 15.39 | -2.39 |
| 15.4 | -2.384 |
| 15.41 | -2.139 |
| 15.42 | -2.166 |
| 15.43 | -2.14 |
| 15.44 | -2.303 |
| 15.45 | -2.13 |
| 15.46 | -2.126 |
| 15.47 | -2.082 |
| 15.48 | -1.877 |
| 15.49 | -1.726 |
| 15.5 | -1.793 |
| 15.51 | -1.708 |
| 15.52 | -1.791 |
| 15.53 | -1.795 |
| 15.54 | -1.879 |
| 15.55 | -1.967 |
| 15.56 | -1.935 |
| 15.57 | -1.898 |
| 15.58 | -1.977 |
| 15.59 | -1.944 |
| 15.6 | -1.861 |
| 15.61 | -1.791 |
| 15.62 | -1.84 |
| 15.63 | -1.813 |
| 15.64 | -1.786 |
| 15.65 | -1.803 |
| 15.66 | -1.8 |
| 15.67 | -1.907 |
| 15.68 | -1.823 |
| 15.69 | -1.875 |
| 15.7 | -1.873 |
| 15.71 | -1.85 |
| 15.72 | -1.967 |
| 15.73 | -1.863 |
| 15.74 | -1.876 |
| 15.75 | -1.873 |
| 15.76 | -1.796 |
| 15.77 | -1.678 |
| 15.78 | -1.793 |
| 15.79 | -1.719 |
| 15.8 | -1.752 |
| 15.81 | -1.731 |
| 15.82 | -1.613 |
| 15.83 | -1.723 |
| 15.84 | -1.758 |
| 15.85 | -1.776 |
| 15.86 | -1.65 |
| 15.87 | -1.806 |
| 15.88 | -1.786 |
| 15.89 | -1.99 |
| 15.9 | -2.06 |
| 15.91 | -2.176 |
| 15.92 | -2.223 |
| 15.93 | -2.137 |
| 15.94 | -2.27 |
| 15.95 | -2.208 |
| 15.96 | -2.213 |
| 15.97 | -2.223 |
| 15.98 | -2.071 |
| 15.99 | -2.211 |
| 16.0 | -2.203 |
| 16.01 | -2.3 |
| 16.02 | -2.224 |
| 16.03 | -2.216 |
| 16.04 | -1.996 |
| 16.05 | -1.895 |
| 16.06 | -2.071 |
| 16.07 | -2.077 |
| 16.08 | -1.975 |
| 16.09 | -2.124 |
| 16.1 | -2.032 |
| 16.11 | -2.039 |
| 16.12 | -2.036 |
| 16.13 | -1.951 |
| 16.14 | -1.865 |
| 16.15 | -1.872 |
| 16.16 | -1.825 |
| 16.17 | -1.762 |
| 16.18 | -1.692 |
| 16.19 | -1.789 |
| 16.2 | -1.85 |
| 16.21 | -1.896 |
| 16.22 | -1.941 |
| 16.23 | -1.901 |
| 16.24 | -1.74 |
| 16.25 | -1.836 |
| 16.26 | -1.738 |
| 16.27 | -1.666 |
| 16.28 | -1.65 |
| 16.29 | -1.635 |
| 16.3 | -1.572 |
| 16.31 | -1.467 |
| 16.32 | -1.517 |
| 16.33 | -1.742 |
| 16.34 | -1.67 |
| 16.35 | -1.809 |
| 16.36 | -1.872 |
| 16.37 | -1.733 |
| 16.38 | -1.832 |
| 16.39 | -1.961 |
| 16.4 | -1.941 |
| 16.41 | -1.942 |
| 16.42 | -1.804 |
| 16.43 | -1.718 |
| 16.44 | -1.811 |
| 16.45 | -1.617 |
| 16.46 | -1.501 |
| 16.47 | -1.36 |
| 16.48 | -1.423 |
| 16.49 | -1.355 |
| 16.5 | -1.278 |
| 16.51 | -1.013 |
| 16.52 | -1.111 |
| 16.53 | -1.241 |
| 16.54 | -1.306 |
| 16.55 | -1.362 |
| 16.56 | -1.254 |
| 16.57 | -1.348 |
| 16.58 | -1.305 |
| 16.59 | -1.395 |
| 16.6 | -1.279 |
| 16.61 | -1.216 |
| 16.62 | -1.15 |
| 16.63 | -1.115 |
| 16.64 | -1.122 |
| 16.65 | -1.22 |
| 16.66 | -1.336 |
| 16.67 | -1.375 |
| 16.68 | -1.31 |
| 16.69 | -1.082 |
| 16.7 | -0.863 |
| 16.71 | -1.121 |
| 16.72 | -1.169 |
| 16.73 | -1.047 |
| 16.74 | -1.094 |
| 16.75 | -1.098 |
| 16.76 | -1.007 |
| 16.77 | -1.157 |
| 16.78 | -1.045 |
| 16.79 | -1.228 |
| 16.8 | -1.332 |
| 16.81 | -1.329 |
| 16.82 | -1.338 |
| 16.83 | -1.21 |
| 16.84 | -1.308 |
| 16.85 | -1.281 |
| 16.86 | -1.298 |
| 16.87 | -1.29 |
| 16.88 | -1.273 |
| 16.89 | -1.215 |
| 16.9 | -1.17 |
| 16.91 | -1.142 |
| 16.92 | -1.271 |
| 16.93 | -1.3 |
| 16.94 | -1.263 |
| 16.95 | -1.114 |
| 16.96 | -1.248 |
| 16.97 | -0.832 |
| 16.98 | -0.833 |
| 16.99 | -0.958 |
| 17.0 | -0.907 |
| 17.01 | -0.633 |
| 17.02 | -0.726 |
| 17.03 | -0.697 |
| 17.04 | -0.633 |
| 17.05 | -0.566 |
| 17.06 | -0.637 |
| 17.07 | -0.553 |
| 17.08 | -0.555 |
| 17.09 | -0.742 |
| 17.1 | -0.727 |
| 17.11 | -0.86 |
| 17.12 | -0.943 |
| 17.13 | -1.137 |
| 17.14 | -1.375 |
| 17.15 | -1.424 |
| 17.16 | -1.402 |
| 17.17 | -1.32 |
| 17.18 | -1.454 |
| 17.19 | -1.26 |
| 17.2 | -1.138 |
| 17.21 | -1.135 |
| 17.22 | -1.13 |
| 17.23 | -1.021 |
| 17.24 | -1.038 |
| 17.25 | -0.958 |
| 17.26 | -1.032 |
| 17.27 | -1.114 |
| 17.28 | -1.264 |
| 17.29 | -1.116 |
| 17.3 | -1.11 |
| 17.31 | -1.114 |
| 17.32 | -1.151 |
| 17.33 | -1.211 |
| 17.34 | -1.135 |
| 17.35 | -1.204 |
| 17.36 | -0.981 |
| 17.37 | -0.77 |
| 17.38 | -0.807 |
| 17.39 | -0.76 |
| 17.4 | -0.815 |
| 17.41 | -0.808 |
| 17.42 | -0.988 |
| 17.43 | -0.99 |
| 17.44 | -0.9 |
| 17.45 | -0.91 |
| 17.46 | -1.057 |
| 17.47 | -0.962 |
| 17.48 | -0.813 |
| 17.49 | -0.778 |
| 17.5 | -0.862 |
| 17.51 | -0.856 |
| 17.52 | -0.845 |
| 17.53 | -0.846 |
| 17.54 | -0.819 |
| 17.55 | -0.952 |
| 17.56 | -1.103 |
| 17.57 | -0.974 |
| 17.58 | -1.006 |
| 17.59 | -0.882 |
| 17.6 | -0.922 |
| 17.61 | -0.872 |
| 17.62 | -0.757 |
| 17.63 | -0.747 |
| 17.64 | -0.745 |
| 17.65 | -0.868 |
| 17.66 | -0.793 |
| 17.67 | -0.965 |
| 17.68 | -0.935 |
| 17.69 | -0.826 |
| 17.7 | -0.839 |
| 17.71 | -0.947 |
| 17.72 | -1.032 |
| 17.73 | -1.108 |
| 17.74 | -0.903 |
| 17.75 | -0.903 |
| 17.76 | -0.799 |
| 17.77 | -0.886 |
| 17.78 | -1.013 |
| 17.79 | -1.078 |
| 17.8 | -1.102 |
| 17.81 | -1.147 |
| 17.82 | -1.105 |
| 17.83 | -1.219 |
| 17.84 | -1.009 |
| 17.85 | -1.066 |
| 17.86 | -1.141 |
| 17.87 | -1.245 |
| 17.88 | -1.187 |
| 17.89 | -1.153 |
| 17.9 | -1.113 |
| 17.91 | -1.048 |
| 17.92 | -1.145 |
| 17.93 | -1.169 |
| 17.94 | -1.303 |
| 17.95 | -1.24 |
| 17.96 | -1.119 |
| 17.97 | -1.126 |
| 17.98 | -1.052 |
| 17.99 | -1.008 |
| 18.0 | -0.827 |
| 18.01 | -0.77 |
| 18.02 | -0.752 |
| 18.03 | -0.616 |
| 18.04 | -0.634 |
| 18.05 | -0.698 |
| 18.06 | -0.66 |
| 18.07 | -0.572 |
| 18.08 | -0.691 |
| 18.09 | -0.653 |
| 18.1 | -0.505 |
| 18.11 | -0.608 |
| 18.12 | -0.648 |
| 18.13 | -0.523 |
| 18.14 | -0.522 |
| 18.15 | -0.629 |
| 18.16 | -0.448 |
| 18.17 | -0.345 |
| 18.18 | -0.444 |
| 18.19 | -0.461 |
| 18.2 | -0.423 |
| 18.21 | -0.391 |
| 18.22 | -0.426 |
| 18.23 | -0.425 |
| 18.24 | -0.502 |
| 18.25 | -0.556 |
| 18.26 | -0.605 |
| 18.27 | -0.658 |
| 18.28 | -0.729 |
| 18.29 | -0.793 |
| 18.3 | -0.575 |
| 18.31 | -0.68 |
| 18.32 | -0.682 |
| 18.33 | -0.708 |
| 18.34 | -0.802 |
| 18.35 | -0.787 |
| 18.36 | -0.8 |
| 18.37 | -0.81 |
| 18.38 | -0.888 |
| 18.39 | -0.838 |
| 18.4 | -0.849 |
| 18.41 | -0.847 |
| 18.42 | -0.861 |
| 18.43 | -0.659 |
| 18.44 | -0.661 |
| 18.45 | -0.422 |
| 18.46 | -0.464 |
| 18.47 | -0.594 |
| 18.48 | -0.554 |
| 18.49 | -0.405 |
| 18.5 | -0.493 |
| 18.51 | -0.585 |
| 18.52 | -0.657 |
| 18.53 | -0.558 |
| 18.54 | -0.504 |
| 18.55 | -0.417 |
| 18.56 | -0.163 |
| 18.57 | -0.254 |
| 18.58 | -0.37 |
| 18.59 | -0.529 |
| 18.6 | -0.424 |
| 18.61 | -0.306 |
| 18.62 | -0.334 |
| 18.63 | -0.347 |
| 18.64 | -0.42 |
| 18.65 | -0.422 |
| 18.66 | -0.429 |
| 18.67 | -0.285 |
| 18.68 | -0.313 |
| 18.69 | -0.208 |
| 18.7 | -0.308 |
| 18.71 | -0.185 |
| 18.72 | -0.302 |
| 18.73 | -0.172 |
| 18.74 | -0.116 |
| 18.75 | -0.037 |
| 18.76 | -0.046 |
| 18.77 | -0.303 |
| 18.78 | -0.554 |
| 18.79 | -0.372 |
| 18.8 | -0.409 |
| 18.81 | -0.384 |
| 18.82 | -0.511 |
| 18.83 | -0.619 |
| 18.84 | -0.592 |
| 18.85 | -0.655 |
| 18.86 | -0.7 |
| 18.87 | -0.811 |
| 18.88 | -0.758 |
| 18.89 | -0.571 |
| 18.9 | -0.503 |
| 18.91 | -0.508 |
| 18.92 | -0.514 |
| 18.93 | -0.705 |
| 18.94 | -0.706 |
| 18.95 | -0.534 |
| 18.96 | -0.461 |
| 18.97 | -0.378 |
| 18.98 | -0.427 |
| 18.99 | -0.325 |
| 19.0 | -0.539 |
| 19.01 | -0.336 |
| 19.02 | -0.306 |
| 19.03 | -0.206 |
| 19.04 | 0.034 |
| 19.05 | 0.214 |
| 19.06 | 0.185 |
| 19.07 | 0.148 |
| 19.08 | 0.049 |
| 19.09 | 0.195 |
| 19.1 | 0.272 |
| 19.11 | 0.264 |
| 19.12 | 0.291 |
| 19.13 | 0.213 |
| 19.14 | 0.14 |
| 19.15 | 0.311 |
| 19.16 | 0.176 |
| 19.17 | 0.286 |
| 19.18 | 0.419 |
| 19.19 | 0.499 |
| 19.2 | 0.185 |
| 19.21 | 0.221 |
| 19.22 | 0.21 |
| 19.23 | 0.302 |
| 19.24 | 0.137 |
| 19.25 | 0.155 |
| 19.26 | 0.152 |
| 19.27 | 0.097 |
| 19.28 | 0.078 |
| 19.29 | 0.052 |
| 19.3 | -0.079 |
| 19.31 | -0.099 |
| 19.32 | -0.064 |
| 19.33 | -0.141 |
| 19.34 | -0.031 |
| 19.35 | -0.043 |
| 19.36 | -0.026 |
| 19.37 | 0.194 |
| 19.38 | 0.35 |
| 19.39 | 0.142 |
| 19.4 | 0.205 |
| 19.41 | 0.074 |
| 19.42 | 0.148 |
| 19.43 | 0.132 |
| 19.44 | 0.196 |
| 19.45 | 0.151 |
| 19.46 | 0.187 |
| 19.47 | 0.172 |
| 19.48 | 0.165 |
| 19.49 | 0.216 |
| 19.5 | 0.227 |
| 19.51 | 0.201 |
| 19.52 | 0.303 |
| 19.53 | 0.371 |
| 19.54 | 0.335 |
| 19.55 | 0.378 |
| 19.56 | 0.469 |
| 19.57 | 0.128 |
| 19.58 | 0.033 |
| 19.59 | -0.001 |
| 19.6 | -0.123 |
| 19.61 | -0.117 |
| 19.62 | -0.338 |
| 19.63 | -0.394 |
| 19.64 | -0.365 |
| 19.65 | -0.44 |
| 19.66 | -0.352 |
| 19.67 | -0.378 |
| 19.68 | -0.386 |
| 19.69 | -0.512 |
| 19.7 | -0.455 |
| 19.71 | -0.63 |
| 19.72 | -0.811 |
| 19.73 | -0.802 |
| 19.74 | -0.854 |
| 19.75 | -0.635 |
| 19.76 | -0.613 |
| 19.77 | -0.517 |
| 19.78 | -0.461 |
| 19.79 | -0.413 |
| 19.8 | -0.366 |
| 19.81 | -0.352 |
| 19.82 | -0.237 |
| 19.83 | -0.221 |
| 19.84 | -0.133 |
| 19.85 | 0.008 |
| 19.86 | 0.065 |
| 19.87 | 0.269 |
| 19.88 | 0.266 |
| 19.89 | 0.114 |
| 19.9 | 0.255 |
| 19.91 | 0.201 |
| 19.92 | 0.072 |
| 19.93 | -0.016 |
| 19.94 | -0.074 |
| 19.95 | -0.008 |
| 19.96 | 0.04 |
| 19.97 | -0.058 |
| 19.98 | -0.113 |
| 19.99 | -0.442 |
| 20.0 | -0.263 |